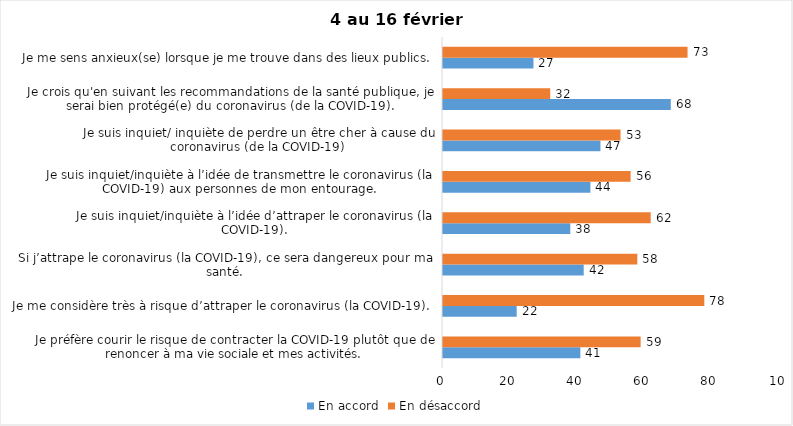
| Category | En accord | En désaccord |
|---|---|---|
| Je préfère courir le risque de contracter la COVID-19 plutôt que de renoncer à ma vie sociale et mes activités. | 41 | 59 |
| Je me considère très à risque d’attraper le coronavirus (la COVID-19). | 22 | 78 |
| Si j’attrape le coronavirus (la COVID-19), ce sera dangereux pour ma santé. | 42 | 58 |
| Je suis inquiet/inquiète à l’idée d’attraper le coronavirus (la COVID-19). | 38 | 62 |
| Je suis inquiet/inquiète à l’idée de transmettre le coronavirus (la COVID-19) aux personnes de mon entourage. | 44 | 56 |
| Je suis inquiet/ inquiète de perdre un être cher à cause du coronavirus (de la COVID-19) | 47 | 53 |
| Je crois qu'en suivant les recommandations de la santé publique, je serai bien protégé(e) du coronavirus (de la COVID-19). | 68 | 32 |
| Je me sens anxieux(se) lorsque je me trouve dans des lieux publics. | 27 | 73 |